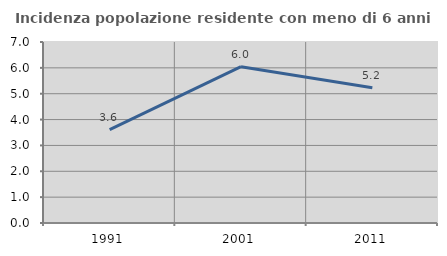
| Category | Incidenza popolazione residente con meno di 6 anni |
|---|---|
| 1991.0 | 3.611 |
| 2001.0 | 6.045 |
| 2011.0 | 5.234 |